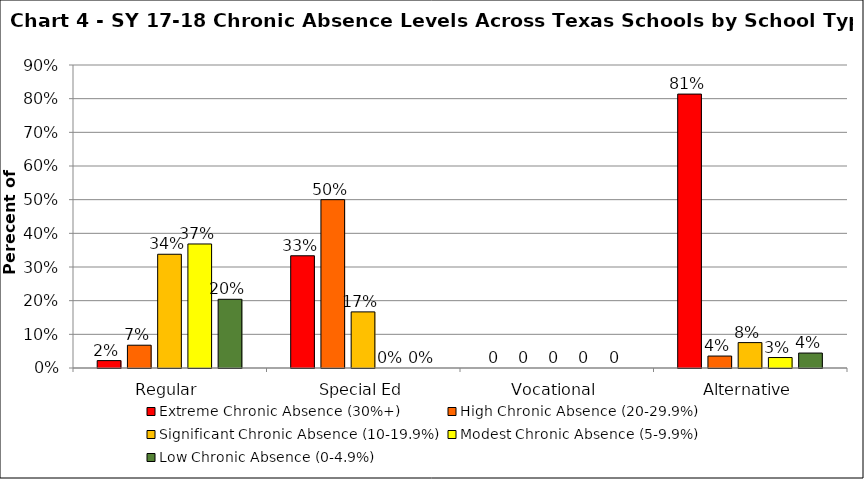
| Category | Extreme Chronic Absence (30%+) | High Chronic Absence (20-29.9%) | Significant Chronic Absence (10-19.9%) | Modest Chronic Absence (5-9.9%) | Low Chronic Absence (0-4.9%) |
|---|---|---|---|---|---|
| 0 | 0.022 | 0.068 | 0.338 | 0.368 | 0.204 |
| 1 | 0.333 | 0.5 | 0.167 | 0 | 0 |
| 2 | 0 | 0 | 0 | 0 | 0 |
| 3 | 0.814 | 0.036 | 0.075 | 0.031 | 0.044 |